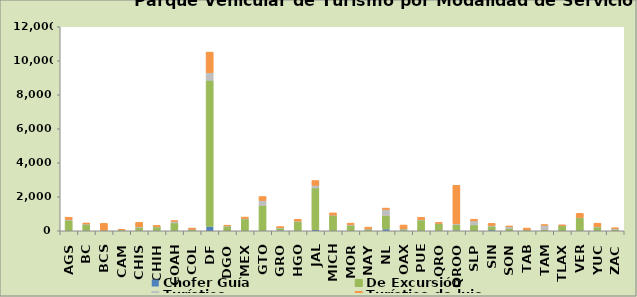
| Category | Chofer Guía | De Excursión | Turístico | Turístico de lujo |
|---|---|---|---|---|
| AGS | 0 | 621 | 49 | 127 |
| BC | 18 | 369 | 16 | 57 |
| BCS | 22 | 18 | 0 | 396 |
| CAM | 6 | 51 | 1 | 28 |
| CHIS | 23 | 179 | 38 | 257 |
| CHIH | 23 | 208 | 12 | 72 |
| COAH | 15 | 449 | 102 | 24 |
| COL | 0 | 92 | 2 | 66 |
| DF | 261 | 8588 | 455 | 1209 |
| DGO | 0 | 269 | 31 | 14 |
| MEX | 3 | 695 | 28 | 82 |
| GTO | 16 | 1475 | 295 | 230 |
| GRO | 38 | 126 | 12 | 73 |
| HGO | 0 | 526 | 45 | 106 |
| JAL | 59 | 2461 | 158 | 279 |
| MICH | 3 | 898 | 23 | 130 |
| MOR | 10 | 312 | 45 | 82 |
| NAY | 6 | 105 | 1 | 103 |
| NL | 108 | 791 | 353 | 83 |
| OAX | 33 | 77 | 9 | 221 |
| PUE | 2 | 632 | 33 | 126 |
| QRO | 22 | 395 | 23 | 50 |
| QROO | 38 | 326 | 50 | 2262 |
| SLP | 0 | 345 | 237 | 99 |
| SIN | 53 | 208 | 57 | 118 |
| SON | 0 | 142 | 98 | 42 |
| TAB | 3 | 53 | 0 | 106 |
| TAM | 0 | 68 | 264 | 13 |
| TLAX | 0 | 309 | 4 | 15 |
| VER | 3 | 761 | 22 | 241 |
| YUC | 14 | 217 | 7 | 209 |
| ZAC | 0 | 85 | 50 | 35 |